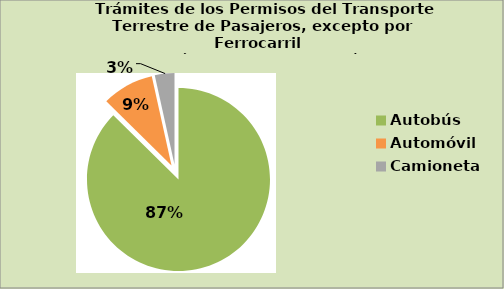
| Category | Series 0 |
|---|---|
| Autobús | 87.373 |
| Automóvil | 9.164 |
| Camioneta | 3.463 |